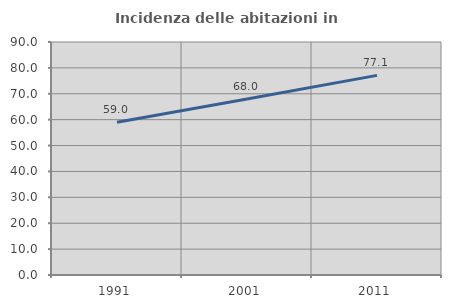
| Category | Incidenza delle abitazioni in proprietà  |
|---|---|
| 1991.0 | 58.97 |
| 2001.0 | 67.964 |
| 2011.0 | 77.111 |